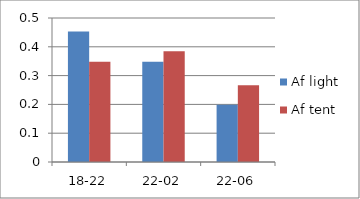
| Category | Af light | Af tent |
|---|---|---|
| 18-22 | 0.453 | 0.348 |
| 22-02 | 0.348 | 0.385 |
| 22-06 | 0.199 | 0.267 |